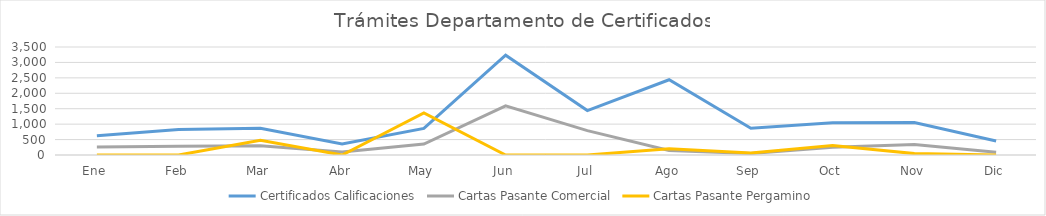
| Category | Certificados Calificaciones | Cartas Pasante Comercial | Cartas Pasante Pergamino |
|---|---|---|---|
| Ene | 623 | 257 | 0 |
| Feb | 823 | 284 | 0 |
| Mar | 866 | 299 | 479 |
| Abr | 361 | 95 | 0 |
| May | 863 | 355 | 1361 |
| Jun | 3236 | 1592 | 0 |
| Jul | 1440 | 789 | 0 |
| Ago | 2439 | 147 | 203 |
| Sep | 868 | 50 | 68 |
| Oct | 1044 | 253 | 309 |
| Nov | 1051 | 342 | 45 |
| Dic | 452 | 92 | 0 |